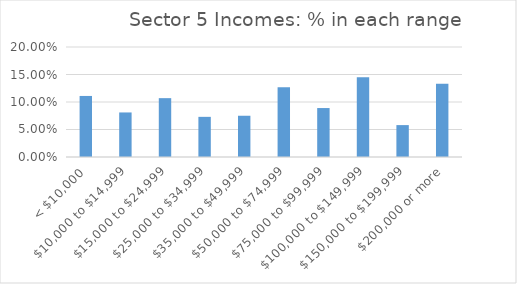
| Category | Series 0 |
|---|---|
| < $10,000 | 0.111 |
| $10,000 to $14,999 | 0.081 |
| $15,000 to $24,999 | 0.107 |
| $25,000 to $34,999 | 0.073 |
| $35,000 to $49,999 | 0.075 |
| $50,000 to $74,999 | 0.127 |
| $75,000 to $99,999 | 0.089 |
| $100,000 to $149,999 | 0.145 |
| $150,000 to $199,999 | 0.058 |
| $200,000 or more | 0.133 |